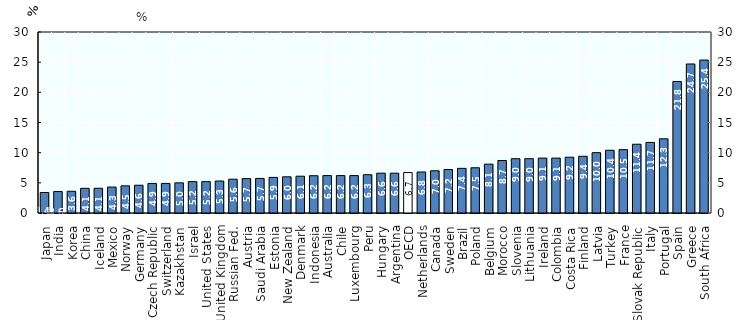
| Category | HURS 2015-Q3 |
|---|---|
| Japan  | 3.4 |
| India  | 3.558 |
| Korea  | 3.6 |
| China  | 4.09 |
| Iceland  | 4.1 |
| Mexico  | 4.3 |
| Norway  | 4.5 |
| Germany  | 4.6 |
| Czech Republic  | 4.9 |
| Switzerland  | 4.9 |
| Kazakhstan  | 5 |
| Israel  | 5.2 |
| United States  | 5.2 |
| United Kingdom  | 5.3 |
| Russian Fed.  | 5.6 |
| Austria  | 5.7 |
| Saudi Arabia  | 5.728 |
| Estonia  | 5.9 |
| New Zealand  | 6 |
| Denmark  | 6.1 |
| Indonesia  | 6.18 |
| Australia  | 6.2 |
| Chile  | 6.2 |
| Luxembourg  | 6.2 |
| Peru  | 6.344 |
| Hungary  | 6.6 |
| Argentina  | 6.6 |
| OECD  | 6.7 |
| Netherlands  | 6.8 |
| Canada  | 7 |
| Sweden  | 7.2 |
| Brazil  | 7.4 |
| Poland  | 7.5 |
| Belgium  | 8.1 |
| Morocco  | 8.7 |
| Slovenia  | 9 |
| Lithuania  | 9 |
| Ireland  | 9.1 |
| Colombia  | 9.1 |
| Costa Rica  | 9.246 |
| Finland  | 9.4 |
| Latvia  | 10 |
| Turkey  | 10.4 |
| France  | 10.5 |
| Slovak Republic  | 11.4 |
| Italy  | 11.7 |
| Portugal  | 12.3 |
| Spain  | 21.8 |
| Greece  | 24.7 |
| South Africa  | 25.354 |